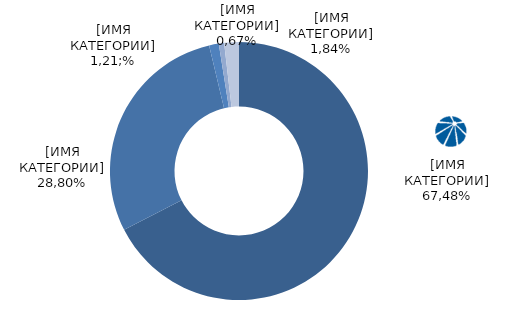
| Category | Series 0 |
|---|---|
| ПАО "Россети" | 0.675 |
| г. Санкт-Петербург в лице КИО | 0.288 |
| ОАО "МРСК Урала" | 0.012 |
| ООО "ЭНЕРГОТРАНС" | 0.007 |
| Прочие | 0.018 |